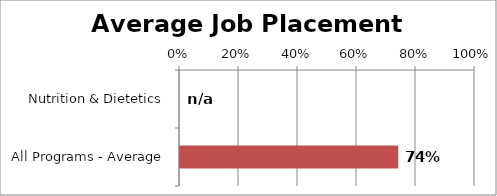
| Category | Series 0 |
|---|---|
| Nutrition & Dietetics | 0 |
| All Programs - Average | 0.74 |